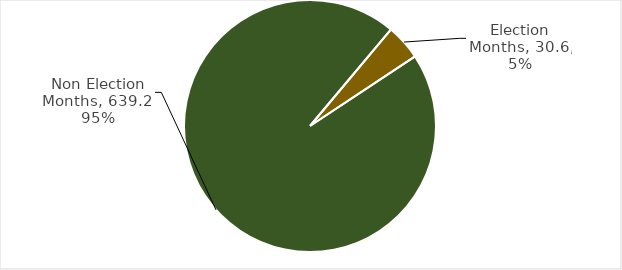
| Category | Total Grants |
|---|---|
| Election Months | 30.603 |
| Non Election Months | 639.164 |